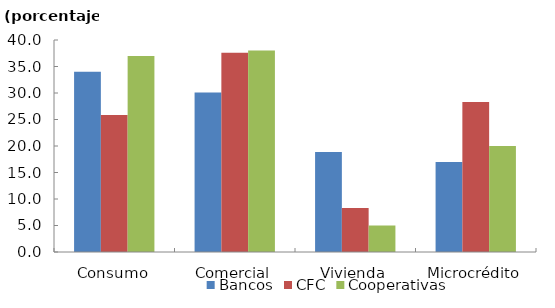
| Category | Bancos | CFC | Cooperativas |
|---|---|---|---|
| Consumo | 34 | 25.857 | 37 |
| Comercial | 30.111 | 37.571 | 38 |
| Vivienda | 18.889 | 8.286 | 5 |
| Microcrédito | 17 | 28.286 | 20 |